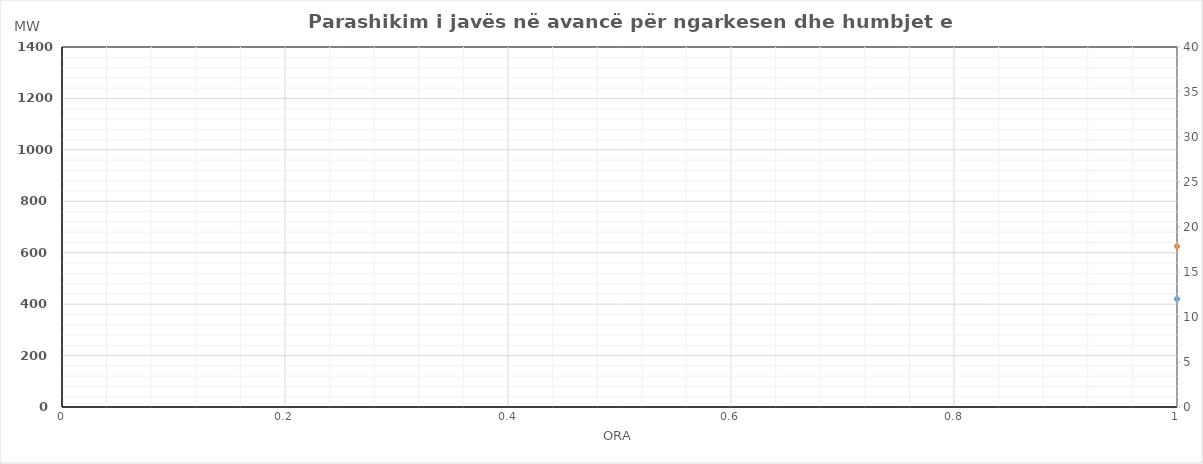
| Category | Ngarkesa (MWh) |
|---|---|
| 0 | 625.25 |
| 1 | 559.35 |
| 2 | 529.26 |
| 3 | 520.24 |
| 4 | 530.25 |
| 5 | 595.29 |
| 6 | 726.82 |
| 7 | 908.64 |
| 8 | 1031.73 |
| 9 | 1058.72 |
| 10 | 982.69 |
| 11 | 954.79 |
| 12 | 881.91 |
| 13 | 873.92 |
| 14 | 870.85 |
| 15 | 871.84 |
| 16 | 885.95 |
| 17 | 1010.97 |
| 18 | 1116.9 |
| 19 | 1135.91 |
| 20 | 1115.91 |
| 21 | 1006.02 |
| 22 | 863.02 |
| 23 | 736.05 |
| 24 | 650.15 |
| 25 | 561.15 |
| 26 | 510.16 |
| 27 | 487.14 |
| 28 | 490.15 |
| 29 | 534.19 |
| 30 | 622.12 |
| 31 | 756.04 |
| 32 | 865.13 |
| 33 | 909.12 |
| 34 | 907.09 |
| 35 | 894.09 |
| 36 | 825.31 |
| 37 | 816.32 |
| 38 | 801.25 |
| 39 | 796.34 |
| 40 | 825.35 |
| 41 | 939.37 |
| 42 | 1075.4 |
| 43 | 1113.31 |
| 44 | 1091.41 |
| 45 | 989.42 |
| 46 | 832.42 |
| 47 | 669.45 |
| 48 | 567.25 |
| 49 | 500.35 |
| 50 | 471.36 |
| 51 | 465.34 |
| 52 | 474.35 |
| 53 | 536.39 |
| 54 | 689.38 |
| 55 | 896.4 |
| 56 | 959.49 |
| 57 | 960.48 |
| 58 | 919.45 |
| 59 | 855.45 |
| 60 | 841.67 |
| 61 | 843.78 |
| 62 | 834.71 |
| 63 | 852.7 |
| 64 | 862.71 |
| 65 | 933.73 |
| 66 | 1085.76 |
| 67 | 1084.77 |
| 68 | 1056.77 |
| 69 | 965.78 |
| 70 | 828.78 |
| 71 | 661.81 |
| 72 | 568.26 |
| 73 | 505.27 |
| 74 | 497.28 |
| 75 | 490.3 |
| 76 | 500.26 |
| 77 | 563.28 |
| 78 | 711.21 |
| 79 | 889.19 |
| 80 | 931.09 |
| 81 | 923.15 |
| 82 | 926.15 |
| 83 | 965.21 |
| 84 | 986.23 |
| 85 | 1008.23 |
| 86 | 1016.2 |
| 87 | 982.24 |
| 88 | 1004.23 |
| 89 | 1084.39 |
| 90 | 1191.5 |
| 91 | 1206.49 |
| 92 | 1099.61 |
| 93 | 1004.66 |
| 94 | 869.69 |
| 95 | 743.66 |
| 96 | 600.54 |
| 97 | 530.58 |
| 98 | 498.58 |
| 99 | 487.58 |
| 100 | 493.57 |
| 101 | 555.61 |
| 102 | 699.54 |
| 103 | 878.53 |
| 104 | 941.61 |
| 105 | 939.58 |
| 106 | 853.61 |
| 107 | 820.6 |
| 108 | 810.66 |
| 109 | 795.73 |
| 110 | 801.7 |
| 111 | 851.64 |
| 112 | 879.68 |
| 113 | 952.7 |
| 114 | 1043.78 |
| 115 | 1051.79 |
| 116 | 1024.78 |
| 117 | 923.81 |
| 118 | 795.84 |
| 119 | 661.79 |
| 120 | 567.34 |
| 121 | 513.38 |
| 122 | 489.38 |
| 123 | 483.38 |
| 124 | 491.37 |
| 125 | 551.41 |
| 126 | 707.34 |
| 127 | 906.33 |
| 128 | 950.41 |
| 129 | 888.38 |
| 130 | 856.41 |
| 131 | 795.5 |
| 132 | 783.46 |
| 133 | 793.43 |
| 134 | 833.4 |
| 135 | 840.34 |
| 136 | 864.38 |
| 137 | 949.4 |
| 138 | 1059.48 |
| 139 | 1075.49 |
| 140 | 1051.48 |
| 141 | 947.51 |
| 142 | 813.54 |
| 143 | 676.49 |
| 144 | 549.37 |
| 145 | 488.4 |
| 146 | 464.37 |
| 147 | 508.36 |
| 148 | 492.36 |
| 149 | 537.36 |
| 150 | 670.3 |
| 151 | 846.32 |
| 152 | 875.34 |
| 153 | 855.07 |
| 154 | 809.37 |
| 155 | 759.3 |
| 156 | 752.34 |
| 157 | 734.76 |
| 158 | 753.4 |
| 159 | 769.38 |
| 160 | 794.75 |
| 161 | 894.3 |
| 162 | 1000.41 |
| 163 | 1020.4 |
| 164 | 991.52 |
| 165 | 888.64 |
| 166 | 748.34 |
| 167 | 641.76 |